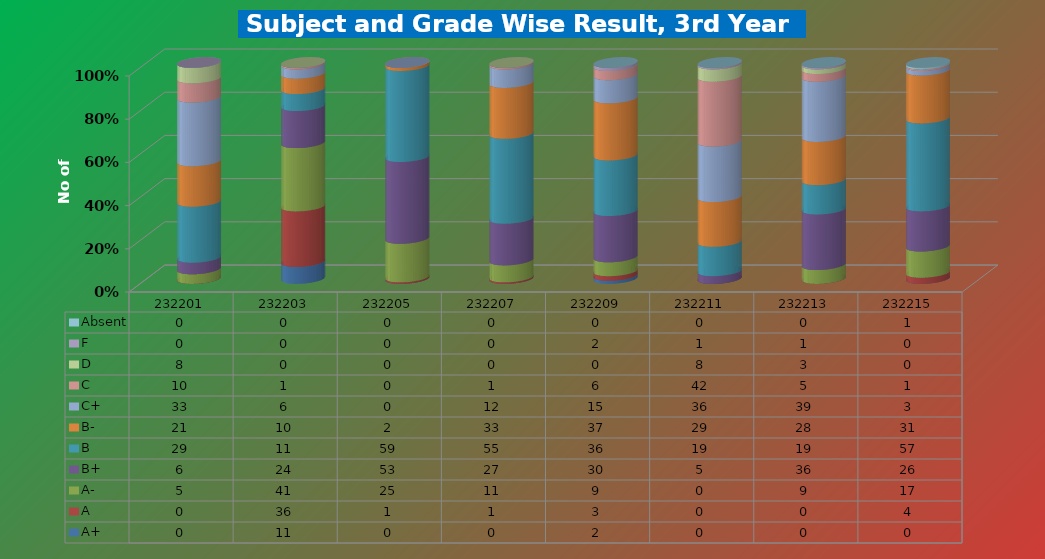
| Category | A+ | A | A- | B+ | B | B- | C+ | C | D | F | Absent |
|---|---|---|---|---|---|---|---|---|---|---|---|
| 232201.0 | 0 | 0 | 5 | 6 | 29 | 21 | 33 | 10 | 8 | 0 | 0 |
| 232203.0 | 11 | 36 | 41 | 24 | 11 | 10 | 6 | 1 | 0 | 0 | 0 |
| 232205.0 | 0 | 1 | 25 | 53 | 59 | 2 | 0 | 0 | 0 | 0 | 0 |
| 232207.0 | 0 | 1 | 11 | 27 | 55 | 33 | 12 | 1 | 0 | 0 | 0 |
| 232209.0 | 2 | 3 | 9 | 30 | 36 | 37 | 15 | 6 | 0 | 2 | 0 |
| 232211.0 | 0 | 0 | 0 | 5 | 19 | 29 | 36 | 42 | 8 | 1 | 0 |
| 232213.0 | 0 | 0 | 9 | 36 | 19 | 28 | 39 | 5 | 3 | 1 | 0 |
| 232215.0 | 0 | 4 | 17 | 26 | 57 | 31 | 3 | 1 | 0 | 0 | 1 |